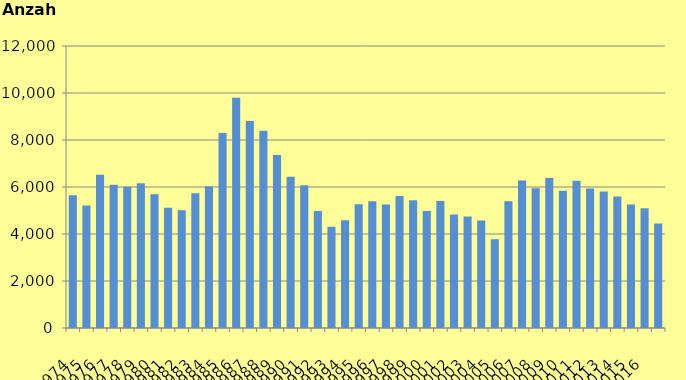
| Category | Series 8 |
|---|---|
| 1974.0 | 5644 |
| 1975.0 | 5214 |
| 1976.0 | 6517 |
| 1977.0 | 6091 |
| 1978.0 | 6014 |
| 1979.0 | 6164 |
| 1980.0 | 5690 |
| 1981.0 | 5117 |
| 1982.0 | 5015 |
| 1983.0 | 5734 |
| 1984.0 | 6037 |
| 1985.0 | 8295 |
| 1986.0 | 9793 |
| 1987.0 | 8804 |
| 1988.0 | 8390 |
| 1989.0 | 7357 |
| 1990.0 | 6438 |
| 1991.0 | 6077 |
| 1992.0 | 4982 |
| 1993.0 | 4313 |
| 1994.0 | 4586 |
| 1995.0 | 5268 |
| 1996.0 | 5395 |
| 1997.0 | 5253 |
| 1998.0 | 5622 |
| 1999.0 | 5439 |
| 2000.0 | 4982 |
| 2001.0 | 5399 |
| 2002.0 | 4827 |
| 2003.0 | 4750 |
| 2004.0 | 4574 |
| 2005.0 | 3776 |
| 2006.0 | 5395 |
| 2007.0 | 6272 |
| 2008.0 | 5949 |
| 2009.0 | 6387 |
| 2010.0 | 5840 |
| 2011.0 | 6270 |
| 2012.0 | 5941 |
| 2013.0 | 5810 |
| 2014.0 | 5591 |
| 2015.0 | 5251 |
| 2016.0 | 5099 |